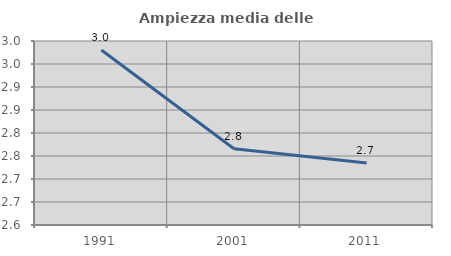
| Category | Ampiezza media delle famiglie |
|---|---|
| 1991.0 | 2.98 |
| 2001.0 | 2.766 |
| 2011.0 | 2.735 |